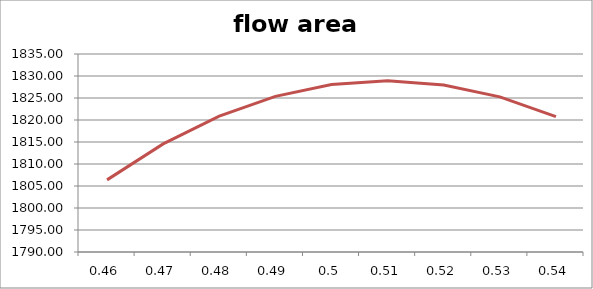
| Category | flow area (mm2) |
|---|---|
| 0.46 | 1806.39 |
| 0.47 | 1814.569 |
| 0.48 | 1820.891 |
| 0.49 | 1825.376 |
| 0.5 | 1828.043 |
| 0.51 | 1828.905 |
| 0.52 | 1827.971 |
| 0.53 | 1825.251 |
| 0.54 | 1820.749 |